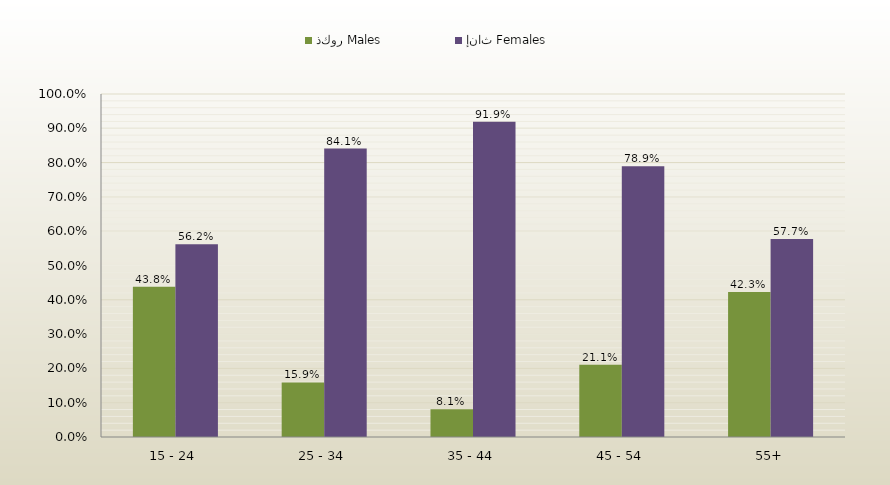
| Category | ذكور Males | إناث Females |
|---|---|---|
| 15 - 24 | 0.438 | 0.562 |
| 25 - 34 | 0.159 | 0.841 |
| 35 - 44 | 0.081 | 0.919 |
| 45 - 54 | 0.211 | 0.789 |
| 55+ | 0.423 | 0.577 |